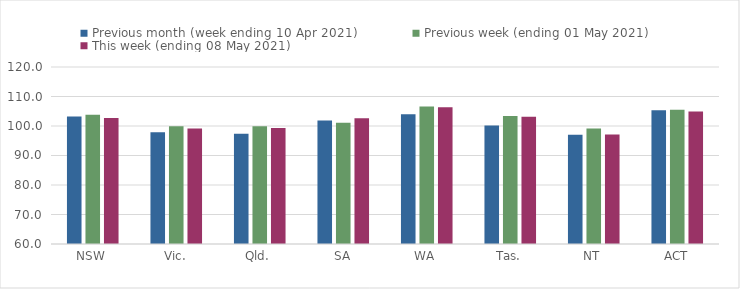
| Category | Previous month (week ending 10 Apr 2021) | Previous week (ending 01 May 2021) | This week (ending 08 May 2021) |
|---|---|---|---|
| NSW | 103.22 | 103.79 | 102.72 |
| Vic. | 97.92 | 99.9 | 99.16 |
| Qld. | 97.38 | 99.94 | 99.33 |
| SA | 101.86 | 101.06 | 102.62 |
| WA | 103.97 | 106.57 | 106.32 |
| Tas. | 100.13 | 103.4 | 103.1 |
| NT | 97.06 | 99.15 | 97.12 |
| ACT | 105.36 | 105.52 | 104.89 |